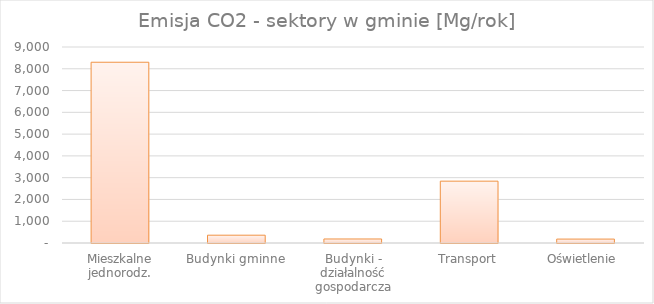
| Category | Series 0 |
|---|---|
| Mieszkalne jednorodz. | 8300.205 |
| Budynki gminne | 358.157 |
| Budynki - działalność gospodarcza | 184.998 |
| Transport | 2839.727 |
| Oświetlenie  | 179.657 |